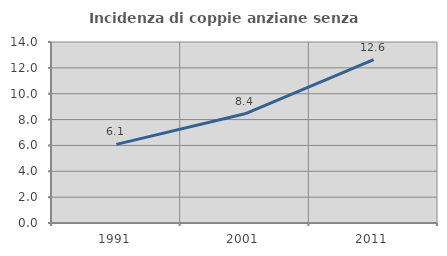
| Category | Incidenza di coppie anziane senza figli  |
|---|---|
| 1991.0 | 6.08 |
| 2001.0 | 8.448 |
| 2011.0 | 12.629 |